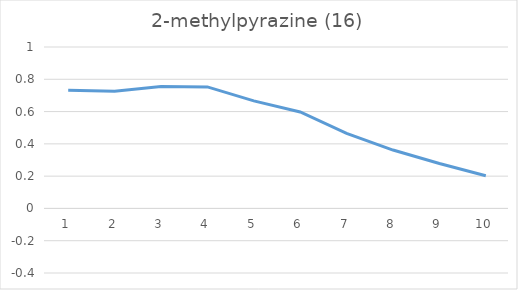
| Category | Series 0 |
|---|---|
| 0 | 0.732 |
| 1 | 0.725 |
| 2 | 0.755 |
| 3 | 0.753 |
| 4 | 0.666 |
| 5 | 0.598 |
| 6 | 0.464 |
| 7 | 0.362 |
| 8 | 0.278 |
| 9 | 0.202 |